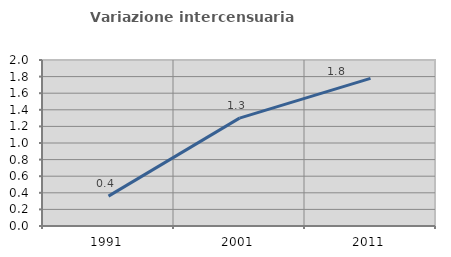
| Category | Variazione intercensuaria annua |
|---|---|
| 1991.0 | 0.36 |
| 2001.0 | 1.299 |
| 2011.0 | 1.778 |